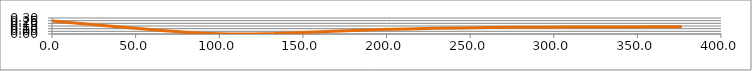
| Category | Series 0 |
|---|---|
| 0.0 | 0.246 |
| 62.2559 | 0.073 |
| 81.9962 | 0.028 |
| 99.9882 | 0.005 |
| 116.861 | 0 |
| 133.094 | 0.009 |
| 149.021 | 0.027 |
| 164.855 | 0.046 |
| 180.714 | 0.066 |
| 196.656 | 0.082 |
| 212.699 | 0.096 |
| 228.841 | 0.106 |
| 245.07 | 0.114 |
| 261.369 | 0.12 |
| 277.724 | 0.125 |
| 294.122 | 0.128 |
| 310.556 | 0.131 |
| 327.019 | 0.132 |
| 343.509 | 0.133 |
| 360.025 | 0.134 |
| 376.569 | 0.135 |